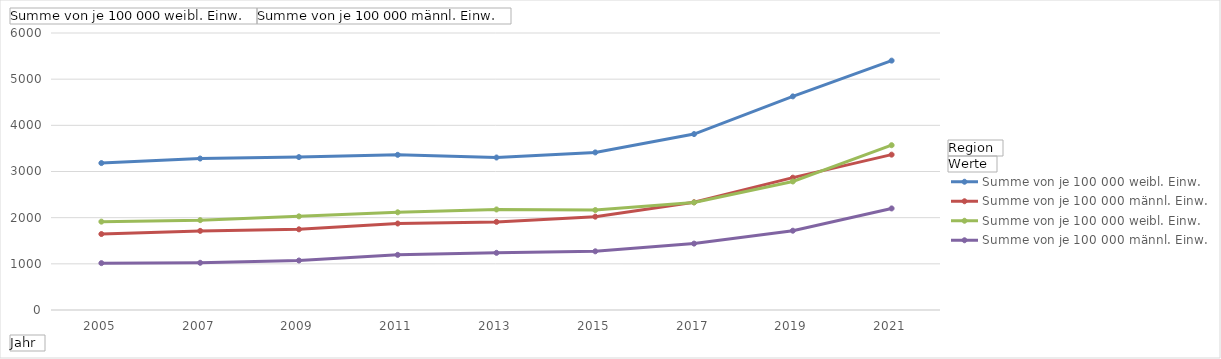
| Category | Bayern - Summe von je 100 000 weibl. Einw. | Bayern - Summe von je 100 000 männl. Einw. | Freising (Lkr) - Summe von je 100 000 weibl. Einw. | Freising (Lkr) - Summe von je 100 000 männl. Einw. |
|---|---|---|---|---|
| 2005 | 3182.7 | 1645.4 | 1913.8 | 1015.3 |
| 2007 | 3280.7 | 1713.8 | 1946.3 | 1022.5 |
| 2009 | 3311.9 | 1747.6 | 2028.6 | 1071.8 |
| 2011 | 3361 | 1873.5 | 2116.1 | 1194.4 |
| 2013 | 3303.1 | 1908.7 | 2177.8 | 1238.3 |
| 2015 | 3413.2 | 2022 | 2164.7 | 1271.2 |
| 2017 | 3810.7 | 2333.9 | 2329.2 | 1438.1 |
| 2019 | 4627.1 | 2866.4 | 2783.6 | 1717.3 |
| 2021 | 5401.6 | 3365 | 3569.5 | 2200 |